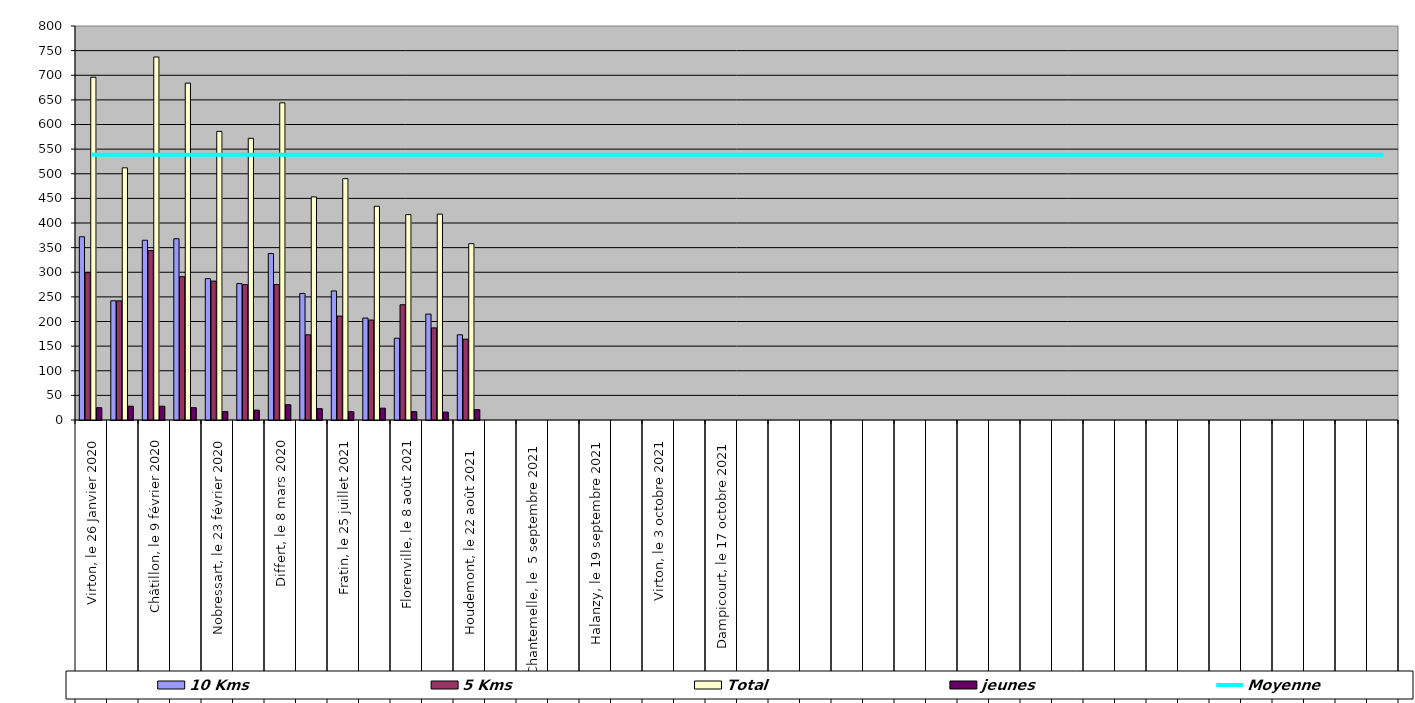
| Category | 10 Kms | 5 Kms | Total | jeunes |
|---|---|---|---|---|
| 0 | 372 | 299 | 696 | 25 |
| 1 | 242 | 242 | 512 | 28 |
| 2 | 365 | 344 | 737 | 28 |
| 3 | 368 | 291 | 684 | 25 |
| 4 | 287 | 282 | 586 | 17 |
| 5 | 277 | 275 | 572 | 20 |
| 6 | 338 | 275 | 644 | 31 |
| 7 | 257 | 173 | 453 | 23 |
| 8 | 262 | 211 | 490 | 17 |
| 9 | 207 | 203 | 434 | 24 |
| 10 | 166 | 234 | 417 | 17 |
| 11 | 215 | 187 | 418 | 16 |
| 12 | 173 | 164 | 358 | 21 |
| 13 | 0 | 0 | 0 | 0 |
| 14 | 0 | 0 | 0 | 0 |
| 15 | 0 | 0 | 0 | 0 |
| 16 | 0 | 0 | 0 | 0 |
| 17 | 0 | 0 | 0 | 0 |
| 18 | 0 | 0 | 0 | 0 |
| 19 | 0 | 0 | 0 | 0 |
| 20 | 0 | 0 | 0 | 0 |
| 21 | 0 | 0 | 0 | 0 |
| 22 | 0 | 0 | 0 | 0 |
| 23 | 0 | 0 | 0 | 0 |
| 24 | 0 | 0 | 0 | 0 |
| 25 | 0 | 0 | 0 | 0 |
| 26 | 0 | 0 | 0 | 0 |
| 27 | 0 | 0 | 0 | 0 |
| 28 | 0 | 0 | 0 | 0 |
| 29 | 0 | 0 | 0 | 0 |
| 30 | 0 | 0 | 0 | 0 |
| 31 | 0 | 0 | 0 | 0 |
| 32 | 0 | 0 | 0 | 0 |
| 33 | 0 | 0 | 0 | 0 |
| 34 | 0 | 0 | 0 | 0 |
| 35 | 0 | 0 | 0 | 0 |
| 36 | 0 | 0 | 0 | 0 |
| 37 | 0 | 0 | 0 | 0 |
| 38 | 0 | 0 | 0 | 0 |
| 39 | 0 | 0 | 0 | 0 |
| 40 | 0 | 0 | 0 | 0 |
| 41 | 0 | 0 | 0 | 0 |